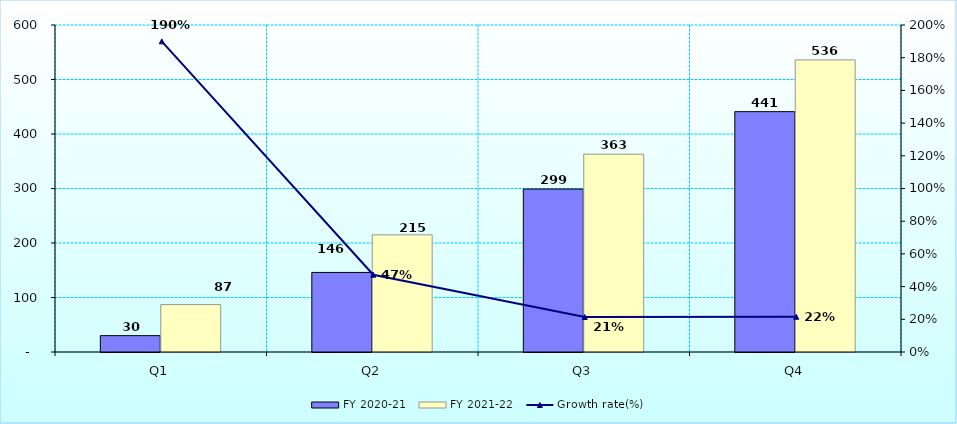
| Category | FY 2020-21 | FY 2021-22 |
|---|---|---|
| Q1 | 30 | 87 |
| Q2 | 146 | 215 |
| Q3 | 299 | 363 |
| Q4 | 441 | 536 |